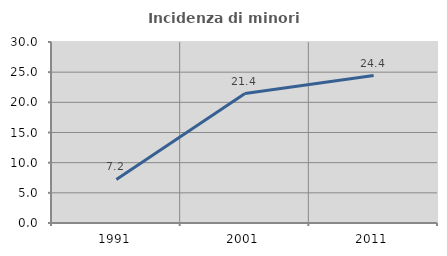
| Category | Incidenza di minori stranieri |
|---|---|
| 1991.0 | 7.229 |
| 2001.0 | 21.447 |
| 2011.0 | 24.443 |